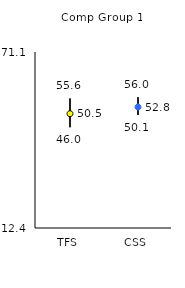
| Category | 25th | 75th | Mean |
|---|---|---|---|
| TFS | 46 | 55.6 | 50.52 |
| CSS | 50.1 | 56 | 52.75 |